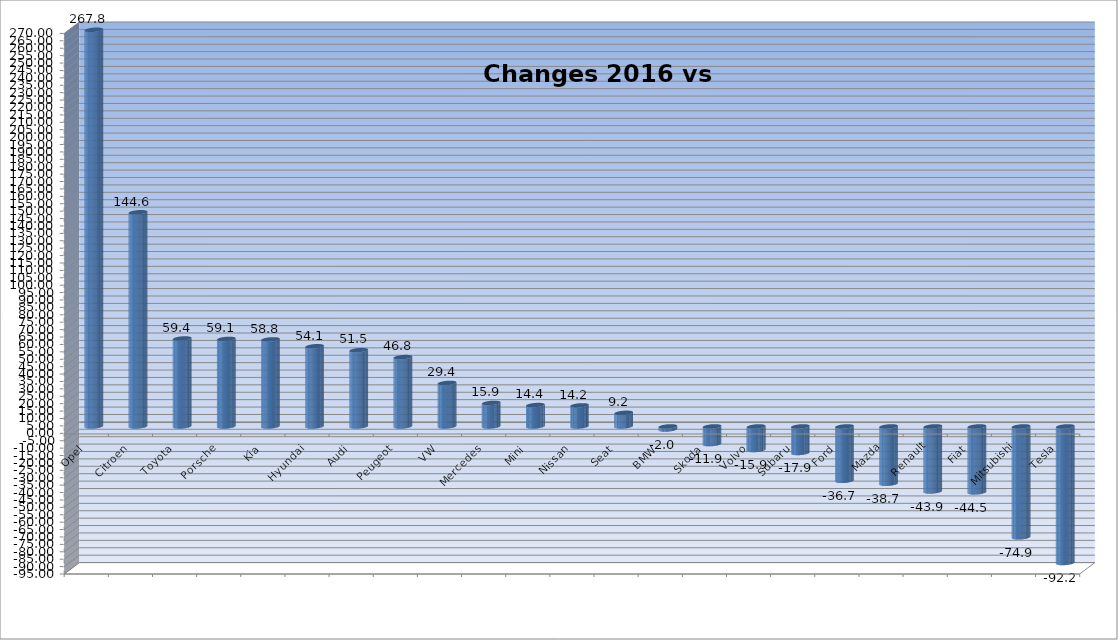
| Category | Ytd 2015 |
|---|---|
| Opel | 267.816 |
| Citroen | 144.604 |
| Toyota | 59.382 |
| Porsche | 59.091 |
| Kia | 58.771 |
| Hyundai | 54.137 |
| Audi | 51.522 |
| Peugeot | 46.82 |
| VW | 29.35 |
| Mercedes | 15.879 |
| Mini | 14.437 |
| Nissan | 14.203 |
| Seat | 9.192 |
| BMW | -2.035 |
| Skoda | -11.907 |
| Volvo | -15.899 |
| Subaru | -17.886 |
| Ford | -36.719 |
| Mazda | -38.655 |
| Renault | -43.906 |
| Fiat | -44.519 |
| Mitsubishi | -74.85 |
| Tesla | -92.199 |